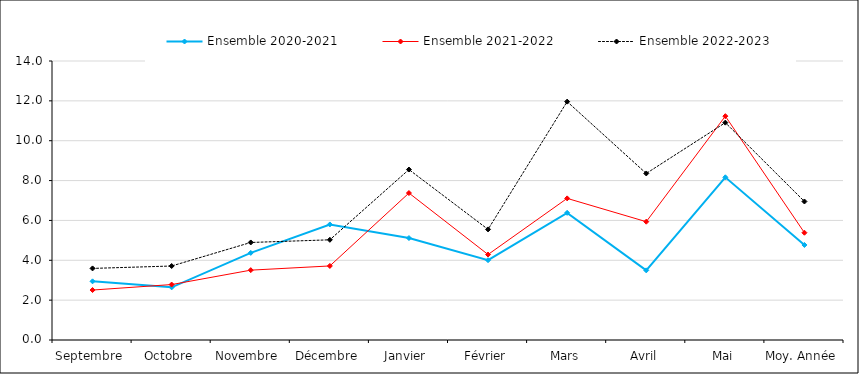
| Category | Ensemble |
|---|---|
| Septembre | 3.592 |
| Octobre | 3.713 |
| Novembre | 4.894 |
| Décembre | 5.027 |
| Janvier | 8.553 |
| Février | 5.55 |
| Mars | 11.962 |
| Avril | 8.357 |
| Mai | 10.907 |
| Moy. Année | 6.951 |